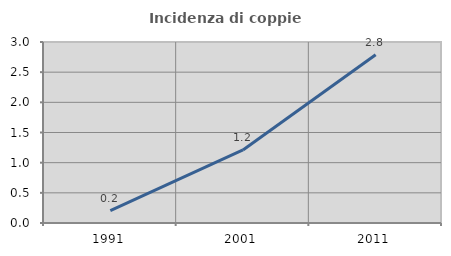
| Category | Incidenza di coppie miste |
|---|---|
| 1991.0 | 0.204 |
| 2001.0 | 1.21 |
| 2011.0 | 2.788 |